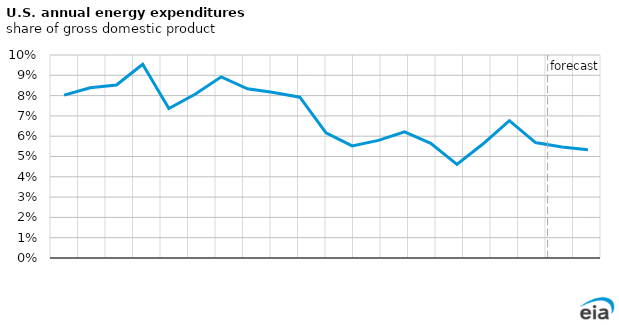
| Category | Energy expenditures as a share of GDP |
|---|---|
| 2005.0 | 0.08 |
| 2006.0 | 0.084 |
| 2007.0 | 0.085 |
| 2008.0 | 0.095 |
| 2009.0 | 0.074 |
| 2010.0 | 0.081 |
| 2011.0 | 0.089 |
| 2012.0 | 0.083 |
| 2013.0 | 0.082 |
| 2014.0 | 0.079 |
| 2015.0 | 0.062 |
| 2016.0 | 0.055 |
| 2017.0 | 0.058 |
| 2018.0 | 0.062 |
| 2019.0 | 0.057 |
| 2020.0 | 0.046 |
| 2021.0 | 0.056 |
| 2022.0 | 0.068 |
| 2023.0 | 0.057 |
| 2024.0 | 0.055 |
| 2025.0 | 0.053 |